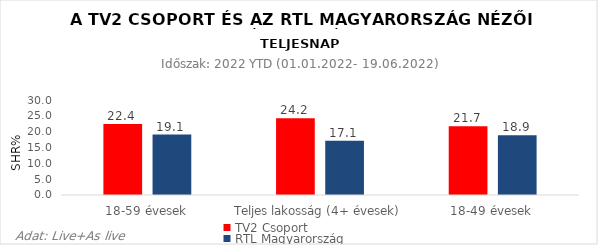
| Category | TV2 Csoport | RTL Magyarország |
|---|---|---|
| 18-59 évesek | 22.4 | 19.1 |
| Teljes lakosság (4+ évesek) | 24.2 | 17.1 |
| 18-49 évesek | 21.7 | 18.9 |